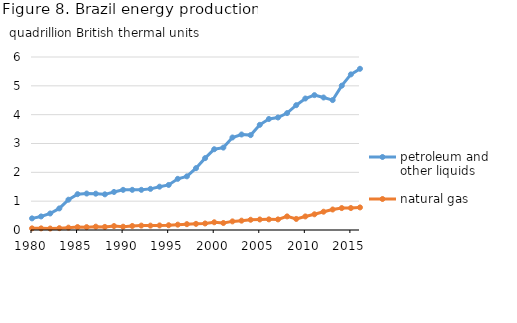
| Category | petroleum and other liquids | natural gas |
|---|---|---|
| 1980.0 | 0.403 | 0.057 |
| 1981.0 | 0.47 | 0.057 |
| 1982.0 | 0.573 | 0.051 |
| 1983.0 | 0.748 | 0.063 |
| 1984.0 | 1.051 | 0.082 |
| 1985.0 | 1.243 | 0.102 |
| 1986.0 | 1.265 | 0.1 |
| 1987.0 | 1.26 | 0.116 |
| 1988.0 | 1.237 | 0.107 |
| 1989.0 | 1.32 | 0.136 |
| 1990.0 | 1.392 | 0.114 |
| 1991.0 | 1.393 | 0.14 |
| 1992.0 | 1.393 | 0.153 |
| 1993.0 | 1.426 | 0.152 |
| 1994.0 | 1.503 | 0.158 |
| 1995.0 | 1.562 | 0.166 |
| 1996.0 | 1.774 | 0.185 |
| 1997.0 | 1.861 | 0.203 |
| 1998.0 | 2.144 | 0.213 |
| 1999.0 | 2.493 | 0.227 |
| 2000.0 | 2.801 | 0.268 |
| 2001.0 | 2.857 | 0.243 |
| 2002.0 | 3.209 | 0.299 |
| 2003.0 | 3.313 | 0.324 |
| 2004.0 | 3.291 | 0.355 |
| 2005.0 | 3.647 | 0.365 |
| 2006.0 | 3.85 | 0.369 |
| 2007.0 | 3.902 | 0.368 |
| 2008.0 | 4.054 | 0.472 |
| 2009.0 | 4.329 | 0.384 |
| 2010.0 | 4.561 | 0.47 |
| 2011.0 | 4.677 | 0.545 |
| 2012.0 | 4.595 | 0.634 |
| 2013.0 | 4.506 | 0.711 |
| 2014.0 | 5.006 | 0.76 |
| 2015.0 | 5.397 | 0.763 |
| 2016.0 | 5.592 | 0.783 |